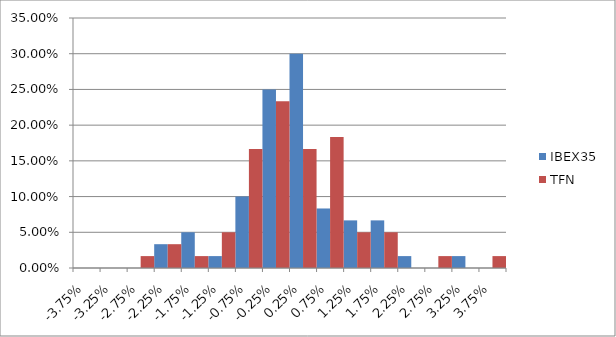
| Category | IBEX35 | TFN |
|---|---|---|
| -0.037500000000000006 | 0 | 0 |
| -0.0325 | 0 | 0 |
| -0.027500000000000004 | 0 | 0.017 |
| -0.0225 | 0.033 | 0.033 |
| -0.0175 | 0.05 | 0.017 |
| -0.012499999999999999 | 0.017 | 0.05 |
| -0.007499999999999998 | 0.1 | 0.167 |
| -0.002499999999999999 | 0.25 | 0.233 |
| 0.0025 | 0.3 | 0.167 |
| 0.0075 | 0.083 | 0.183 |
| 0.0125 | 0.067 | 0.05 |
| 0.0175 | 0.067 | 0.05 |
| 0.0225 | 0.017 | 0 |
| 0.027500000000000004 | 0 | 0.017 |
| 0.0325 | 0.017 | 0 |
| 0.037500000000000006 | 0 | 0.017 |